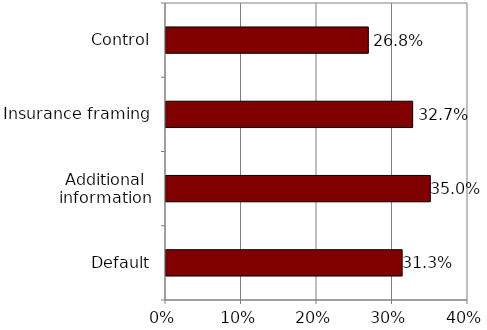
| Category | Series 0 |
|---|---|
| Default | 0.313 |
| Additional information | 0.35 |
| Insurance framing | 0.327 |
| Control | 0.268 |